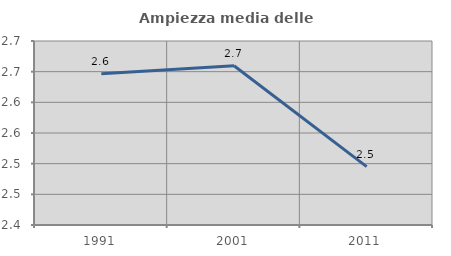
| Category | Ampiezza media delle famiglie |
|---|---|
| 1991.0 | 2.646 |
| 2001.0 | 2.66 |
| 2011.0 | 2.495 |